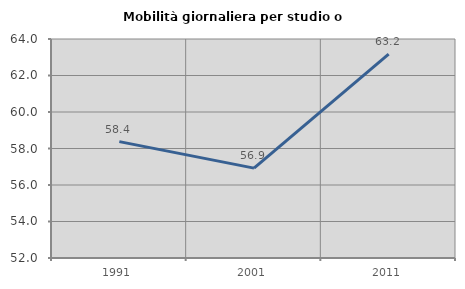
| Category | Mobilità giornaliera per studio o lavoro |
|---|---|
| 1991.0 | 58.376 |
| 2001.0 | 56.926 |
| 2011.0 | 63.173 |